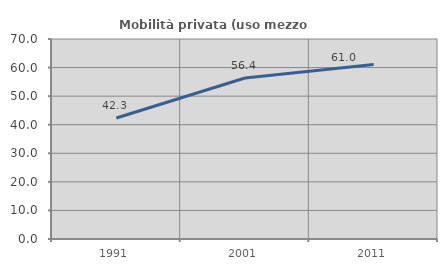
| Category | Mobilità privata (uso mezzo privato) |
|---|---|
| 1991.0 | 42.35 |
| 2001.0 | 56.365 |
| 2011.0 | 61.046 |